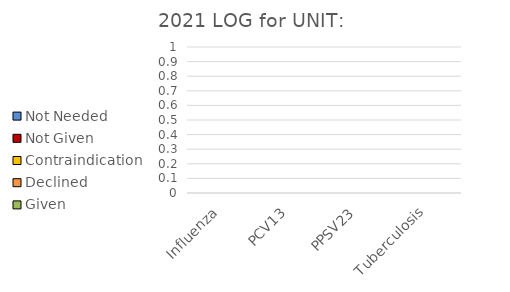
| Category | Given | Declined | Contraindication | Not Given | Not Needed |
|---|---|---|---|---|---|
| Influenza | 0 | 0 | 0 | 0 | 0 |
| PCV13 | 0 | 0 | 0 | 0 | 0 |
| PPSV23 | 0 | 0 | 0 | 0 | 0 |
| Tuberculosis | 0 | 0 | 0 | 0 | 0 |